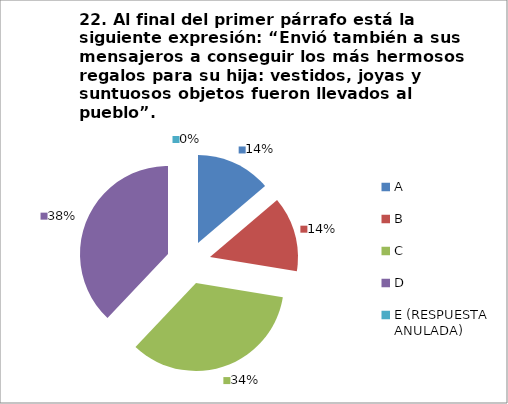
| Category | CANTIDAD DE RESPUESTAS PREGUNTA (22) | PORCENTAJE |
|---|---|---|
| A | 4 | 0.138 |
| B | 4 | 0.138 |
| C | 10 | 0.345 |
| D | 11 | 0.379 |
| E (RESPUESTA ANULADA) | 0 | 0 |